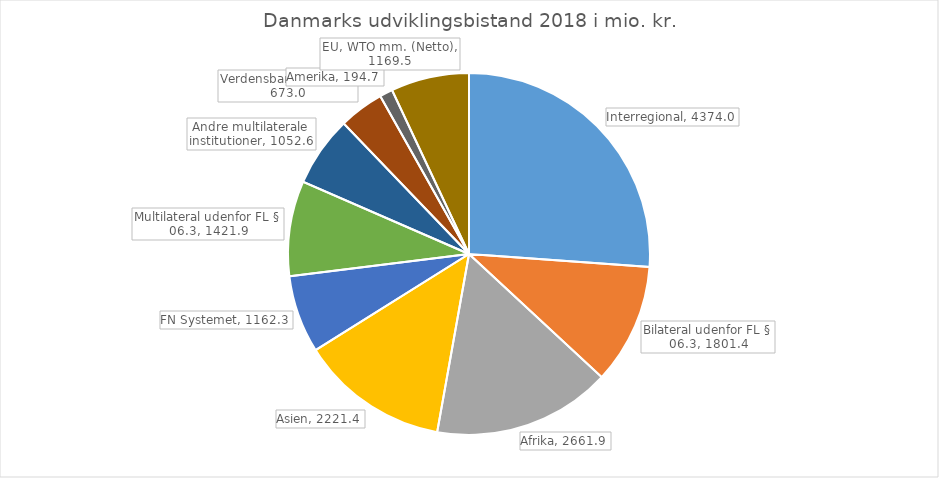
| Category | Series 0 |
|---|---|
| Interregional | 4373.952 |
| Bilateral udenfor FL § 06.3 | 1801.434 |
| Afrika | 2661.879 |
| Asien | 2221.38 |
| FN Systemet | 1162.278 |
| Multilateral udenfor FL § 06.3 | 1421.873 |
| Andre multilaterale institutioner | 1052.61 |
| Verdensbankgruppen | 672.98 |
| Amerika | 194.725 |
| EU, WTO mm. (Netto) | 1169.524 |